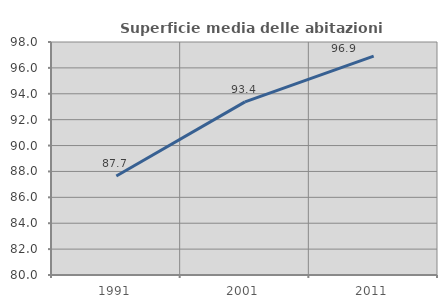
| Category | Superficie media delle abitazioni occupate |
|---|---|
| 1991.0 | 87.651 |
| 2001.0 | 93.378 |
| 2011.0 | 96.912 |